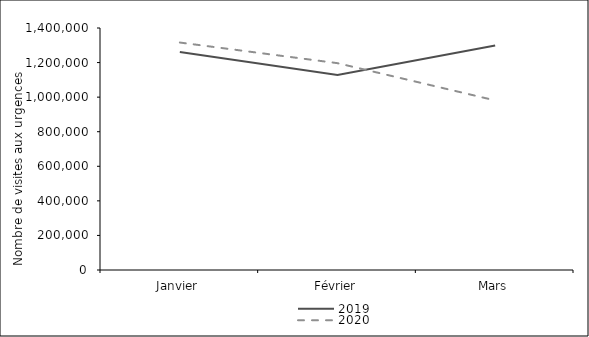
| Category | 2019 | 2020 |
|---|---|---|
| 0 | 1261379 | 1315925 |
| 1 | 1127733 | 1196538 |
| 2 | 1299110 | 981069 |